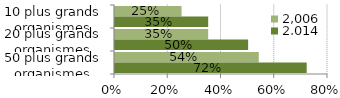
| Category | 2 006 | 2 014 |
|---|---|---|
| 10 plus grands organismes | 0.25 | 0.35 |
| 20 plus grands organismes | 0.35 | 0.5 |
| 50 plus grands organismes | 0.54 | 0.72 |